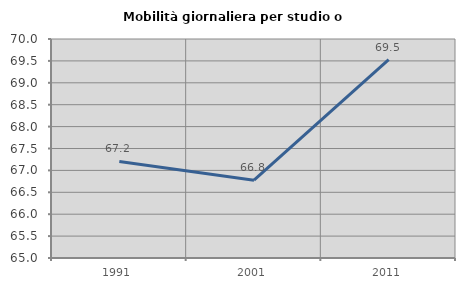
| Category | Mobilità giornaliera per studio o lavoro |
|---|---|
| 1991.0 | 67.206 |
| 2001.0 | 66.776 |
| 2011.0 | 69.528 |